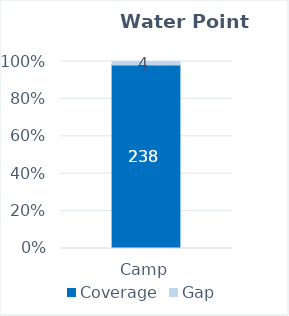
| Category | Coverage | Gap |
|---|---|---|
| Camp | 238.314 | 4.494 |